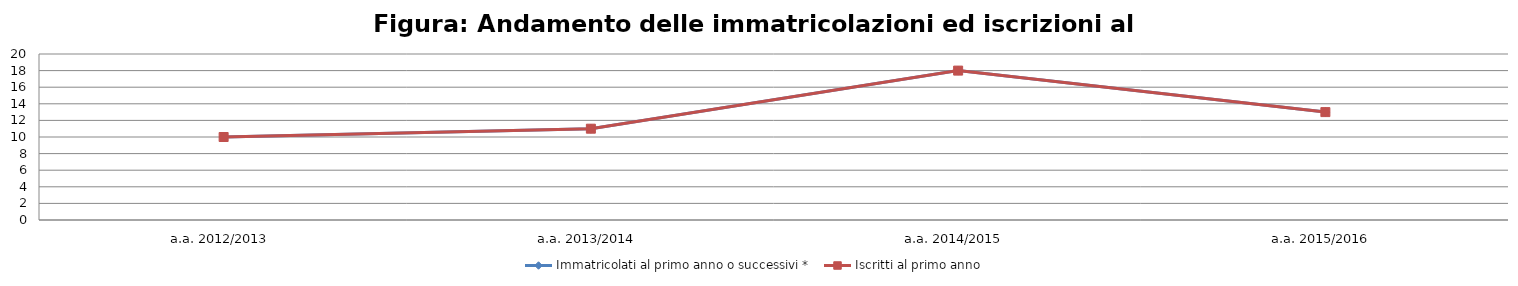
| Category | Immatricolati al primo anno o successivi * | Iscritti al primo anno  |
|---|---|---|
| a.a. 2012/2013 | 10 | 10 |
| a.a. 2013/2014 | 11 | 11 |
| a.a. 2014/2015 | 18 | 18 |
| a.a. 2015/2016 | 13 | 13 |